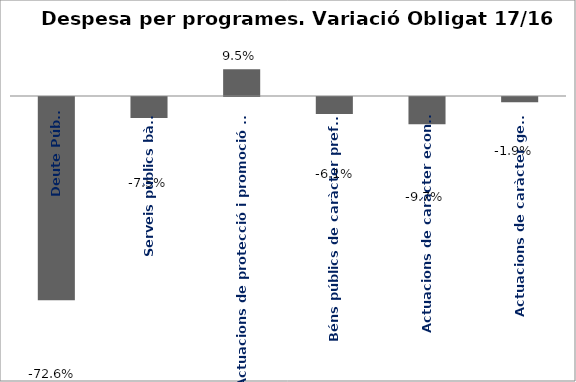
| Category | Series 0 |
|---|---|
| Deute Públic | -0.726 |
| Serveis públics bàsics | -0.075 |
| Actuacions de protecció i promoció social | 0.095 |
| Béns públics de caràcter preferent | -0.061 |
| Actuacions de caràcter econòmic | -0.097 |
| Actuacions de caràcter general | -0.019 |